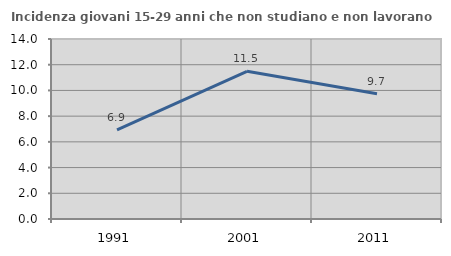
| Category | Incidenza giovani 15-29 anni che non studiano e non lavorano  |
|---|---|
| 1991.0 | 6.936 |
| 2001.0 | 11.486 |
| 2011.0 | 9.735 |